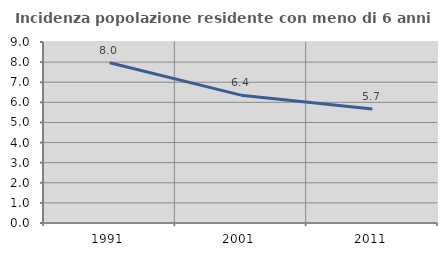
| Category | Incidenza popolazione residente con meno di 6 anni |
|---|---|
| 1991.0 | 7.967 |
| 2001.0 | 6.357 |
| 2011.0 | 5.668 |